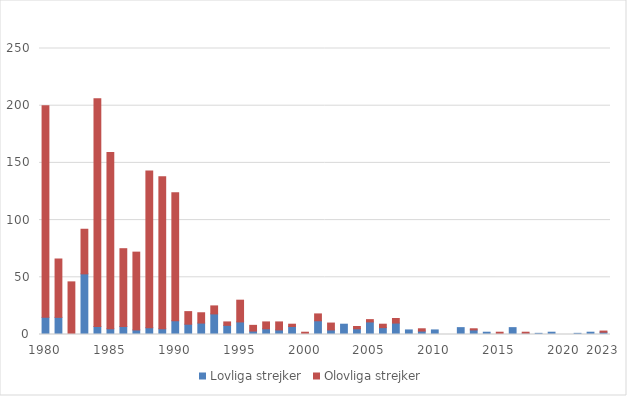
| Category | Lovliga strejker | Olovliga strejker |
|---|---|---|
| 1980 | 15 | 185 |
|  | 15 | 51 |
|  | 0 | 46 |
|  | 53 | 39 |
|  | 7 | 199 |
| 1985 | 5 | 154 |
|  | 7 | 68 |
|  | 4 | 68 |
|  | 6 | 137 |
|  | 5 | 133 |
| 1990 | 12 | 112 |
|  | 9 | 11 |
|  | 10 | 9 |
|  | 18 | 7 |
|  | 8 | 3 |
| 1995 | 11 | 19 |
|  | 3 | 5 |
|  | 5 | 6 |
|  | 4 | 7 |
|  | 7 | 2 |
| 2000 | 0 | 2 |
|  | 12 | 6 |
|  | 4 | 6 |
|  | 9 | 0 |
|  | 5 | 2 |
| 2005 | 11 | 2 |
|  | 6 | 3 |
|  | 10 | 4 |
|  | 4 | 0 |
|  | 3 | 2 |
| 2010 | 4 | 0 |
|  | 0 | 0 |
|  | 6 | 0 |
|  | 4 | 1 |
|  | 2 | 0 |
| 2015 | 0 | 2 |
|  | 6 | 0 |
|  | 1 | 1 |
|  | 1 | 0 |
|  | 2 | 0 |
| 2020 | 0 | 0 |
|  | 1 | 0 |
|  | 2 | 0 |
| 2023 | 2 | 1 |